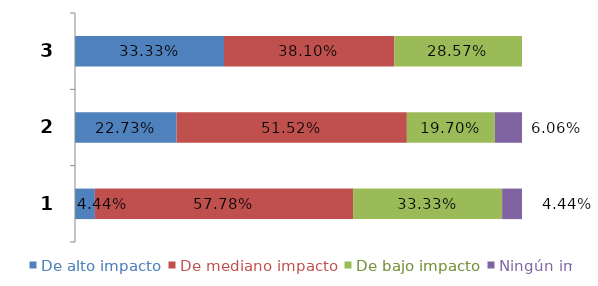
| Category | De alto impacto | De mediano impacto | De bajo impacto | Ningún impacto |
|---|---|---|---|---|
| 0 | 0.044 | 0.578 | 0.333 | 0.044 |
| 1 | 0.227 | 0.515 | 0.197 | 0.061 |
| 2 | 0.333 | 0.381 | 0.286 | 0 |